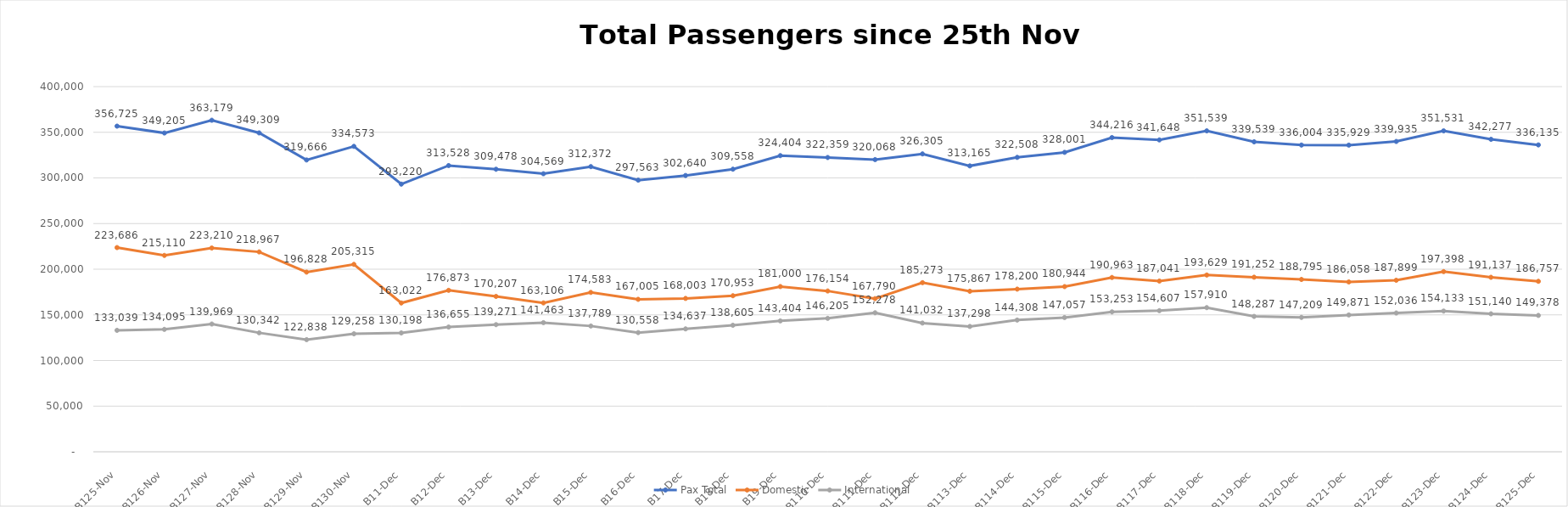
| Category | Pax Total |  Domestic  |  International  |
|---|---|---|---|
| 2022-11-25 | 356725 | 223686 | 133039 |
| 2022-11-26 | 349205 | 215110 | 134095 |
| 2022-11-27 | 363179 | 223210 | 139969 |
| 2022-11-28 | 349309 | 218967 | 130342 |
| 2022-11-29 | 319666 | 196828 | 122838 |
| 2022-11-30 | 334573 | 205315 | 129258 |
| 2022-12-01 | 293220 | 163022 | 130198 |
| 2022-12-02 | 313528 | 176873 | 136655 |
| 2022-12-03 | 309478 | 170207 | 139271 |
| 2022-12-04 | 304569 | 163106 | 141463 |
| 2022-12-05 | 312372 | 174583 | 137789 |
| 2022-12-06 | 297563 | 167005 | 130558 |
| 2022-12-07 | 302640 | 168003 | 134637 |
| 2022-12-08 | 309558 | 170953 | 138605 |
| 2022-12-09 | 324404 | 181000 | 143404 |
| 2022-12-10 | 322359 | 176154 | 146205 |
| 2022-12-11 | 320068 | 167790 | 152278 |
| 2022-12-12 | 326305 | 185273 | 141032 |
| 2022-12-13 | 313165 | 175867 | 137298 |
| 2022-12-14 | 322508 | 178200 | 144308 |
| 2022-12-15 | 328001 | 180944 | 147057 |
| 2022-12-16 | 344216 | 190963 | 153253 |
| 2022-12-17 | 341648 | 187041 | 154607 |
| 2022-12-18 | 351539 | 193629 | 157910 |
| 2022-12-19 | 339539 | 191252 | 148287 |
| 2022-12-20 | 336004 | 188795 | 147209 |
| 2022-12-21 | 335929 | 186058 | 149871 |
| 2022-12-22 | 339935 | 187899 | 152036 |
| 2022-12-23 | 351531 | 197398 | 154133 |
| 2022-12-24 | 342277 | 191137 | 151140 |
| 2022-12-25 | 336135 | 186757 | 149378 |